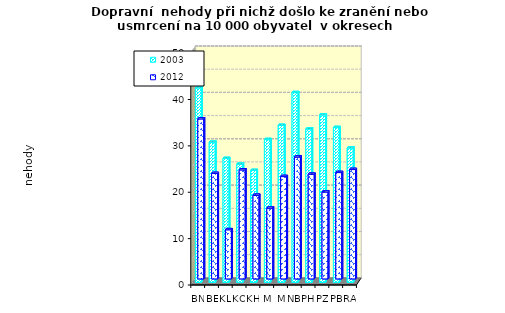
| Category | 2003 | 2012 |
|---|---|---|
| BN | 41.951 | 34.498 |
| BE | 30.244 | 22.737 |
| KL | 26.743 | 10.594 |
| KO | 25.51 | 23.506 |
| KH | 24.158 | 18.025 |
| ME | 30.814 | 15.248 |
| MB | 33.868 | 22.07 |
| NB | 40.939 | 26.275 |
| PH | 33.085 | 22.572 |
| PZ | 36.118 | 18.73 |
| PB | 33.409 | 22.937 |
| RA | 28.991 | 23.59 |